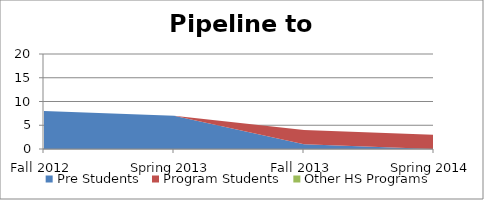
| Category | Pre Students | Program Students | Other HS Programs |
|---|---|---|---|
| Fall 2012 | 8 | 0 | 0 |
| Spring 2013 | 7 | 0 | 0 |
| Fall 2013 | 1 | 3 | 0 |
| Spring 2014 | 0 | 3 | 0 |